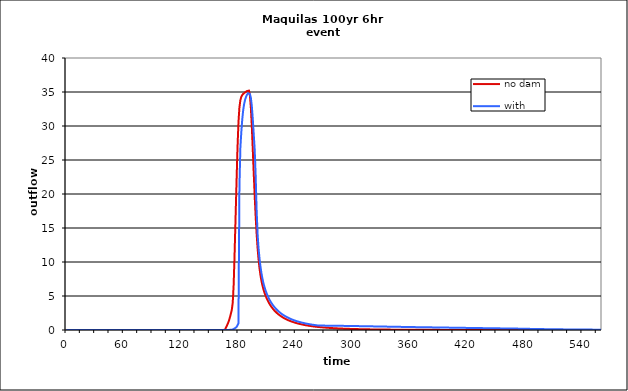
| Category | no dam | with dam |
|---|---|---|
| 0.0 | 0 | 0 |
| 1.0 | 0 | 0 |
| 2.0 | 0 | 0 |
| 3.0 | 0 | 0 |
| 4.0 | 0 | 0 |
| 5.0 | 0 | 0 |
| 6.0 | 0 | 0 |
| 7.0 | 0 | 0 |
| 8.0 | 0 | 0 |
| 9.0 | 0 | 0 |
| 10.0 | 0 | 0 |
| 11.0 | 0 | 0 |
| 12.0 | 0 | 0 |
| 13.0 | 0 | 0 |
| 14.0 | 0 | 0 |
| 15.0 | 0 | 0 |
| 16.0 | 0 | 0 |
| 17.0 | 0 | 0 |
| 18.0 | 0 | 0 |
| 19.0 | 0 | 0 |
| 20.0 | 0 | 0 |
| 21.0 | 0 | 0 |
| 22.0 | 0 | 0 |
| 23.0 | 0 | 0 |
| 24.0 | 0 | 0 |
| 25.0 | 0 | 0 |
| 26.0 | 0 | 0 |
| 27.0 | 0 | 0 |
| 28.0 | 0 | 0 |
| 29.0 | 0 | 0 |
| 30.0 | 0 | 0 |
| 31.0 | 0 | 0 |
| 32.0 | 0 | 0 |
| 33.0 | 0 | 0 |
| 34.0 | 0 | 0 |
| 35.0 | 0 | 0 |
| 36.0 | 0 | 0 |
| 37.0 | 0 | 0 |
| 38.0 | 0 | 0 |
| 39.0 | 0 | 0 |
| 40.0 | 0 | 0 |
| 41.0 | 0 | 0 |
| 42.0 | 0 | 0 |
| 43.0 | 0 | 0 |
| 44.0 | 0 | 0 |
| 45.0 | 0 | 0 |
| 46.0 | 0 | 0 |
| 47.0 | 0 | 0 |
| 48.0 | 0 | 0 |
| 49.0 | 0 | 0 |
| 50.0 | 0 | 0 |
| 51.0 | 0 | 0 |
| 52.0 | 0 | 0 |
| 53.0 | 0 | 0 |
| 54.0 | 0 | 0 |
| 55.0 | 0 | 0 |
| 56.0 | 0 | 0 |
| 57.0 | 0 | 0 |
| 58.0 | 0 | 0 |
| 59.0 | 0 | 0 |
| 60.0 | 0 | 0 |
| 61.0 | 0 | 0 |
| 62.0 | 0 | 0 |
| 63.0 | 0 | 0 |
| 64.0 | 0 | 0 |
| 65.0 | 0 | 0 |
| 66.0 | 0 | 0 |
| 67.0 | 0 | 0 |
| 68.0 | 0 | 0 |
| 69.0 | 0 | 0 |
| 70.0 | 0 | 0 |
| 71.0 | 0 | 0 |
| 72.0 | 0 | 0 |
| 73.0 | 0 | 0 |
| 74.0 | 0 | 0 |
| 75.0 | 0 | 0 |
| 76.0 | 0 | 0 |
| 77.0 | 0 | 0 |
| 78.0 | 0 | 0 |
| 79.0 | 0 | 0 |
| 80.0 | 0 | 0 |
| 81.0 | 0 | 0 |
| 82.0 | 0 | 0 |
| 83.0 | 0 | 0 |
| 84.0 | 0 | 0 |
| 85.0 | 0 | 0 |
| 86.0 | 0 | 0 |
| 87.0 | 0 | 0 |
| 88.0 | 0 | 0 |
| 89.0 | 0 | 0 |
| 90.0 | 0 | 0 |
| 91.0 | 0 | 0 |
| 92.0 | 0 | 0 |
| 93.0 | 0 | 0 |
| 94.0 | 0 | 0 |
| 95.0 | 0 | 0 |
| 96.0 | 0 | 0 |
| 97.0 | 0 | 0 |
| 98.0 | 0 | 0 |
| 99.0 | 0 | 0 |
| 100.0 | 0 | 0 |
| 101.0 | 0 | 0 |
| 102.0 | 0 | 0 |
| 103.0 | 0 | 0 |
| 104.0 | 0 | 0 |
| 105.0 | 0 | 0 |
| 106.0 | 0 | 0 |
| 107.0 | 0 | 0 |
| 108.0 | 0 | 0 |
| 109.0 | 0 | 0 |
| 110.0 | 0 | 0 |
| 111.0 | 0 | 0 |
| 112.0 | 0 | 0 |
| 113.0 | 0 | 0 |
| 114.0 | 0 | 0 |
| 115.0 | 0 | 0 |
| 116.0 | 0 | 0 |
| 117.0 | 0 | 0 |
| 118.0 | 0 | 0 |
| 119.0 | 0 | 0 |
| 120.0 | 0 | 0 |
| 121.0 | 0 | 0 |
| 122.0 | 0 | 0 |
| 123.0 | 0 | 0 |
| 124.0 | 0 | 0 |
| 125.0 | 0 | 0 |
| 126.0 | 0 | 0 |
| 127.0 | 0 | 0 |
| 128.0 | 0 | 0 |
| 129.0 | 0 | 0 |
| 130.0 | 0 | 0 |
| 131.0 | 0 | 0 |
| 132.0 | 0 | 0 |
| 133.0 | 0 | 0 |
| 134.0 | 0 | 0 |
| 135.0 | 0 | 0 |
| 136.0 | 0 | 0 |
| 137.0 | 0 | 0 |
| 138.0 | 0 | 0 |
| 139.0 | 0 | 0 |
| 140.0 | 0 | 0 |
| 141.0 | 0 | 0 |
| 142.0 | 0 | 0 |
| 143.0 | 0 | 0 |
| 144.0 | 0 | 0 |
| 145.0 | 0 | 0 |
| 146.0 | 0 | 0 |
| 147.0 | 0 | 0 |
| 148.0 | 0 | 0 |
| 149.0 | 0 | 0 |
| 150.0 | 0 | 0 |
| 151.0 | 0 | 0 |
| 152.0 | 0 | 0 |
| 153.0 | 0 | 0 |
| 154.0 | 0 | 0 |
| 155.0 | 0 | 0 |
| 156.0 | 0.001 | 0.001 |
| 157.0 | 0.001 | 0.001 |
| 158.0 | 0.001 | 0.001 |
| 159.0 | 0.001 | 0.001 |
| 160.0 | 0.001 | 0.001 |
| 161.0 | 0.002 | 0.002 |
| 162.0 | 0.003 | 0.002 |
| 163.0 | 0.007 | 0.003 |
| 164.0 | 0.002 | 0.004 |
| 165.0 | 0.001 | 0.005 |
| 166.0 | 0.05 | 0.006 |
| 167.0 | 0.384 | 0.007 |
| 168.0 | 0.673 | 0.009 |
| 169.0 | 0.983 | 0.01 |
| 170.0 | 1.35 | 0.011 |
| 171.0 | 1.832 | 0.016 |
| 172.0 | 2.364 | 0.03 |
| 173.0 | 2.935 | 0.05 |
| 174.0 | 3.992 | 0.066 |
| 175.0 | 6.692 | 0.118 |
| 176.0 | 11.428 | 0.232 |
| 177.0 | 16.662 | 0.349 |
| 178.0 | 21.858 | 0.433 |
| 179.0 | 26.785 | 0.493 |
| 180.0 | 30.523 | 0.99 |
| 181.0 | 32.711 | 21.022 |
| 182.0 | 33.791 | 26.779 |
| 183.0 | 34.299 | 29.13 |
| 184.0 | 34.561 | 31.006 |
| 185.0 | 34.726 | 32.38 |
| 186.0 | 34.85 | 33.285 |
| 187.0 | 34.953 | 33.888 |
| 188.0 | 35.051 | 34.308 |
| 189.0 | 35.141 | 34.603 |
| 190.0 | 35.218 | 34.812 |
| 191.0 | 35.207 | 34.884 |
| 192.0 | 34.482 | 34.712 |
| 193.0 | 32.654 | 34.137 |
| 194.0 | 29.866 | 32.911 |
| 195.0 | 26.52 | 31.008 |
| 196.0 | 23.018 | 28.774 |
| 197.0 | 19.689 | 26.521 |
| 198.0 | 16.719 | 22.73 |
| 199.0 | 14.188 | 17.722 |
| 200.0 | 12.11 | 14.191 |
| 201.0 | 10.433 | 12.091 |
| 202.0 | 9.118 | 10.558 |
| 203.0 | 8.091 | 9.363 |
| 204.0 | 7.268 | 8.41 |
| 205.0 | 6.601 | 7.628 |
| 206.0 | 6.055 | 6.981 |
| 207.0 | 5.593 | 6.44 |
| 208.0 | 5.192 | 5.975 |
| 209.0 | 4.836 | 5.57 |
| 210.0 | 4.517 | 5.21 |
| 211.0 | 4.228 | 4.888 |
| 212.0 | 3.965 | 4.595 |
| 213.0 | 3.729 | 4.329 |
| 214.0 | 3.514 | 4.088 |
| 215.0 | 3.314 | 3.869 |
| 216.0 | 3.129 | 3.667 |
| 217.0 | 2.96 | 3.481 |
| 218.0 | 2.804 | 3.31 |
| 219.0 | 2.66 | 3.15 |
| 220.0 | 2.526 | 3.002 |
| 221.0 | 2.402 | 2.864 |
| 222.0 | 2.287 | 2.734 |
| 223.0 | 2.18 | 2.613 |
| 224.0 | 2.08 | 2.5 |
| 225.0 | 1.985 | 2.395 |
| 226.0 | 1.893 | 2.295 |
| 227.0 | 1.806 | 2.201 |
| 228.0 | 1.724 | 2.112 |
| 229.0 | 1.648 | 2.028 |
| 230.0 | 1.576 | 1.949 |
| 231.0 | 1.508 | 1.873 |
| 232.0 | 1.444 | 1.801 |
| 233.0 | 1.385 | 1.733 |
| 234.0 | 1.329 | 1.667 |
| 235.0 | 1.276 | 1.605 |
| 236.0 | 1.225 | 1.545 |
| 237.0 | 1.176 | 1.489 |
| 238.0 | 1.129 | 1.437 |
| 239.0 | 1.085 | 1.388 |
| 240.0 | 1.043 | 1.341 |
| 241.0 | 1.003 | 1.297 |
| 242.0 | 0.965 | 1.254 |
| 243.0 | 0.929 | 1.213 |
| 244.0 | 0.895 | 1.174 |
| 245.0 | 0.862 | 1.137 |
| 246.0 | 0.83 | 1.101 |
| 247.0 | 0.799 | 1.067 |
| 248.0 | 0.769 | 1.034 |
| 249.0 | 0.741 | 1.002 |
| 250.0 | 0.713 | 0.972 |
| 251.0 | 0.688 | 0.943 |
| 252.0 | 0.663 | 0.914 |
| 253.0 | 0.64 | 0.887 |
| 254.0 | 0.617 | 0.862 |
| 255.0 | 0.596 | 0.837 |
| 256.0 | 0.576 | 0.813 |
| 257.0 | 0.556 | 0.79 |
| 258.0 | 0.537 | 0.767 |
| 259.0 | 0.518 | 0.746 |
| 260.0 | 0.5 | 0.726 |
| 261.0 | 0.483 | 0.706 |
| 262.0 | 0.467 | 0.687 |
| 263.0 | 0.452 | 0.67 |
| 264.0 | 0.437 | 0.659 |
| 265.0 | 0.423 | 0.652 |
| 266.0 | 0.41 | 0.65 |
| 267.0 | 0.397 | 0.648 |
| 268.0 | 0.385 | 0.647 |
| 269.0 | 0.373 | 0.645 |
| 270.0 | 0.361 | 0.644 |
| 271.0 | 0.35 | 0.642 |
| 272.0 | 0.339 | 0.641 |
| 273.0 | 0.329 | 0.639 |
| 274.0 | 0.319 | 0.638 |
| 275.0 | 0.309 | 0.636 |
| 276.0 | 0.3 | 0.634 |
| 277.0 | 0.291 | 0.633 |
| 278.0 | 0.283 | 0.631 |
| 279.0 | 0.274 | 0.629 |
| 280.0 | 0.266 | 0.627 |
| 281.0 | 0.258 | 0.625 |
| 282.0 | 0.251 | 0.623 |
| 283.0 | 0.243 | 0.621 |
| 284.0 | 0.236 | 0.619 |
| 285.0 | 0.229 | 0.617 |
| 286.0 | 0.223 | 0.615 |
| 287.0 | 0.217 | 0.613 |
| 288.0 | 0.211 | 0.611 |
| 289.0 | 0.205 | 0.609 |
| 290.0 | 0.199 | 0.607 |
| 291.0 | 0.194 | 0.605 |
| 292.0 | 0.188 | 0.603 |
| 293.0 | 0.183 | 0.6 |
| 294.0 | 0.178 | 0.598 |
| 295.0 | 0.173 | 0.596 |
| 296.0 | 0.168 | 0.594 |
| 297.0 | 0.163 | 0.591 |
| 298.0 | 0.158 | 0.589 |
| 299.0 | 0.154 | 0.587 |
| 300.0 | 0.15 | 0.584 |
| 301.0 | 0.145 | 0.582 |
| 302.0 | 0.142 | 0.58 |
| 303.0 | 0.138 | 0.577 |
| 304.0 | 0.134 | 0.575 |
| 305.0 | 0.13 | 0.573 |
| 306.0 | 0.127 | 0.57 |
| 307.0 | 0.123 | 0.568 |
| 308.0 | 0.12 | 0.565 |
| 309.0 | 0.117 | 0.563 |
| 310.0 | 0.113 | 0.56 |
| 311.0 | 0.11 | 0.558 |
| 312.0 | 0.107 | 0.556 |
| 313.0 | 0.104 | 0.553 |
| 314.0 | 0.101 | 0.551 |
| 315.0 | 0.099 | 0.548 |
| 316.0 | 0.096 | 0.546 |
| 317.0 | 0.094 | 0.543 |
| 318.0 | 0.091 | 0.541 |
| 319.0 | 0.089 | 0.538 |
| 320.0 | 0.087 | 0.536 |
| 321.0 | 0.085 | 0.533 |
| 322.0 | 0.082 | 0.531 |
| 323.0 | 0.08 | 0.528 |
| 324.0 | 0.078 | 0.526 |
| 325.0 | 0.076 | 0.523 |
| 326.0 | 0.074 | 0.52 |
| 327.0 | 0.073 | 0.518 |
| 328.0 | 0.071 | 0.515 |
| 329.0 | 0.069 | 0.513 |
| 330.0 | 0.067 | 0.51 |
| 331.0 | 0.066 | 0.508 |
| 332.0 | 0.064 | 0.505 |
| 333.0 | 0.063 | 0.503 |
| 334.0 | 0.061 | 0.5 |
| 335.0 | 0.06 | 0.498 |
| 336.0 | 0.059 | 0.495 |
| 337.0 | 0.057 | 0.493 |
| 338.0 | 0.056 | 0.49 |
| 339.0 | 0.055 | 0.488 |
| 340.0 | 0.054 | 0.485 |
| 341.0 | 0.053 | 0.482 |
| 342.0 | 0.051 | 0.48 |
| 343.0 | 0.05 | 0.477 |
| 344.0 | 0.049 | 0.475 |
| 345.0 | 0.048 | 0.472 |
| 346.0 | 0.047 | 0.47 |
| 347.0 | 0.046 | 0.467 |
| 348.0 | 0.045 | 0.465 |
| 349.0 | 0.044 | 0.462 |
| 350.0 | 0.043 | 0.46 |
| 351.0 | 0.043 | 0.457 |
| 352.0 | 0.042 | 0.455 |
| 353.0 | 0.041 | 0.452 |
| 354.0 | 0.04 | 0.45 |
| 355.0 | 0.039 | 0.447 |
| 356.0 | 0.038 | 0.445 |
| 357.0 | 0.038 | 0.442 |
| 358.0 | 0.037 | 0.44 |
| 359.0 | 0.036 | 0.437 |
| 360.0 | 0.035 | 0.435 |
| 361.0 | 0.035 | 0.432 |
| 362.0 | 0.034 | 0.43 |
| 363.0 | 0.033 | 0.427 |
| 364.0 | 0.033 | 0.425 |
| 365.0 | 0.032 | 0.423 |
| 366.0 | 0.031 | 0.421 |
| 367.0 | 0.031 | 0.419 |
| 368.0 | 0.03 | 0.417 |
| 369.0 | 0.029 | 0.415 |
| 370.0 | 0.029 | 0.412 |
| 371.0 | 0.028 | 0.41 |
| 372.0 | 0.028 | 0.408 |
| 373.0 | 0.027 | 0.406 |
| 374.0 | 0.027 | 0.404 |
| 375.0 | 0.026 | 0.402 |
| 376.0 | 0.025 | 0.4 |
| 377.0 | 0.025 | 0.398 |
| 378.0 | 0.024 | 0.396 |
| 379.0 | 0.024 | 0.394 |
| 380.0 | 0.023 | 0.392 |
| 381.0 | 0.023 | 0.389 |
| 382.0 | 0.022 | 0.387 |
| 383.0 | 0.022 | 0.385 |
| 384.0 | 0.021 | 0.383 |
| 385.0 | 0.021 | 0.381 |
| 386.0 | 0.02 | 0.379 |
| 387.0 | 0.02 | 0.377 |
| 388.0 | 0.019 | 0.375 |
| 389.0 | 0.019 | 0.373 |
| 390.0 | 0.018 | 0.371 |
| 391.0 | 0.018 | 0.369 |
| 392.0 | 0.018 | 0.367 |
| 393.0 | 0.017 | 0.364 |
| 394.0 | 0.017 | 0.362 |
| 395.0 | 0.016 | 0.36 |
| 396.0 | 0.016 | 0.358 |
| 397.0 | 0.016 | 0.356 |
| 398.0 | 0.015 | 0.354 |
| 399.0 | 0.015 | 0.352 |
| 400.0 | 0.014 | 0.35 |
| 401.0 | 0.014 | 0.348 |
| 402.0 | 0.014 | 0.346 |
| 403.0 | 0.013 | 0.344 |
| 404.0 | 0.013 | 0.341 |
| 405.0 | 0.013 | 0.339 |
| 406.0 | 0.012 | 0.337 |
| 407.0 | 0.012 | 0.335 |
| 408.0 | 0.012 | 0.333 |
| 409.0 | 0.011 | 0.331 |
| 410.0 | 0.011 | 0.329 |
| 411.0 | 0.011 | 0.327 |
| 412.0 | 0.01 | 0.325 |
| 413.0 | 0.01 | 0.323 |
| 414.0 | 0.01 | 0.321 |
| 415.0 | 0.009 | 0.318 |
| 416.0 | 0.009 | 0.316 |
| 417.0 | 0.009 | 0.314 |
| 418.0 | 0.008 | 0.312 |
| 419.0 | 0.008 | 0.31 |
| 420.0 | 0.008 | 0.308 |
| 421.0 | 0.007 | 0.306 |
| 422.0 | 0.007 | 0.304 |
| 423.0 | 0.007 | 0.302 |
| 424.0 | 0.006 | 0.3 |
| 425.0 | 0.006 | 0.298 |
| 426.0 | 0.006 | 0.296 |
| 427.0 | 0.005 | 0.293 |
| 428.0 | 0.005 | 0.291 |
| 429.0 | 0.005 | 0.289 |
| 430.0 | 0.004 | 0.287 |
| 431.0 | 0.004 | 0.285 |
| 432.0 | 0.004 | 0.283 |
| 433.0 | 0.004 | 0.281 |
| 434.0 | 0.003 | 0.279 |
| 435.0 | 0.003 | 0.277 |
| 436.0 | 0.003 | 0.275 |
| 437.0 | 0.003 | 0.273 |
| 438.0 | 0.002 | 0.271 |
| 439.0 | 0.002 | 0.269 |
| 440.0 | 0.002 | 0.267 |
| 441.0 | 0.002 | 0.265 |
| 442.0 | 0.002 | 0.263 |
| 443.0 | 0.001 | 0.261 |
| 444.0 | 0.001 | 0.259 |
| 445.0 | 0.001 | 0.257 |
| 446.0 | 0.001 | 0.255 |
| 447.0 | 0.001 | 0.253 |
| 448.0 | 0.001 | 0.251 |
| 449.0 | 0.001 | 0.249 |
| 450.0 | 0.001 | 0.247 |
| 451.0 | 0.001 | 0.245 |
| 452.0 | 0.001 | 0.243 |
| 453.0 | 0.001 | 0.241 |
| 454.0 | 0 | 0.239 |
| 455.0 | 0 | 0.237 |
| 456.0 | 0 | 0.235 |
| 457.0 | 0 | 0.233 |
| 458.0 | 0 | 0.231 |
| 459.0 | 0 | 0.229 |
| 460.0 | 0 | 0.227 |
| 461.0 | 0 | 0.225 |
| 462.0 | 0 | 0.223 |
| 463.0 | 0 | 0.221 |
| 464.0 | 0 | 0.219 |
| 465.0 | 0 | 0.217 |
| 466.0 | 0 | 0.215 |
| 467.0 | 0 | 0.213 |
| 468.0 | 0 | 0.211 |
| 469.0 | 0 | 0.209 |
| 470.0 | 0 | 0.207 |
| 471.0 | 0 | 0.206 |
| 472.0 | 0 | 0.203 |
| 473.0 | 0 | 0.201 |
| 474.0 | 0 | 0.198 |
| 475.0 | 0 | 0.195 |
| 476.0 | 0 | 0.192 |
| 477.0 | 0 | 0.189 |
| 478.0 | 0 | 0.186 |
| 479.0 | 0 | 0.183 |
| 480.0 | 0 | 0.18 |
| 481.0 | 0 | 0.177 |
| 482.0 | 0 | 0.174 |
| 483.0 | 0 | 0.171 |
| 484.0 | 0 | 0.168 |
| 485.0 | 0 | 0.165 |
| 486.0 | 0 | 0.163 |
| 487.0 | 0 | 0.16 |
| 488.0 | 0 | 0.157 |
| 489.0 | 0 | 0.155 |
| 490.0 | 0 | 0.152 |
| 491.0 | 0 | 0.15 |
| 492.0 | 0 | 0.147 |
| 493.0 | 0 | 0.145 |
| 494.0 | 0 | 0.142 |
| 495.0 | 0 | 0.14 |
| 496.0 | 0 | 0.137 |
| 497.0 | 0 | 0.135 |
| 498.0 | 0 | 0.133 |
| 499.0 | 0 | 0.131 |
| 500.0 | 0 | 0.129 |
| 501.0 | 0 | 0.126 |
| 502.0 | 0 | 0.124 |
| 503.0 | 0 | 0.122 |
| 504.0 | 0 | 0.12 |
| 505.0 | 0 | 0.118 |
| 506.0 | 0 | 0.116 |
| 507.0 | 0 | 0.114 |
| 508.0 | 0 | 0.112 |
| 509.0 | 0 | 0.111 |
| 510.0 | 0 | 0.109 |
| 511.0 | 0 | 0.107 |
| 512.0 | 0 | 0.105 |
| 513.0 | 0 | 0.103 |
| 514.0 | 0 | 0.102 |
| 515.0 | 0 | 0.1 |
| 516.0 | 0 | 0.098 |
| 517.0 | 0 | 0.097 |
| 518.0 | 0 | 0.095 |
| 519.0 | 0 | 0.093 |
| 520.0 | 0 | 0.092 |
| 521.0 | 0 | 0.09 |
| 522.0 | 0 | 0.089 |
| 523.0 | 0 | 0.087 |
| 524.0 | 0 | 0.086 |
| 525.0 | 0 | 0.084 |
| 526.0 | 0 | 0.083 |
| 527.0 | 0 | 0.082 |
| 528.0 | 0 | 0.08 |
| 529.0 | 0 | 0.079 |
| 530.0 | 0 | 0.078 |
| 531.0 | 0 | 0.076 |
| 532.0 | 0 | 0.075 |
| 533.0 | 0 | 0.074 |
| 534.0 | 0 | 0.072 |
| 535.0 | 0 | 0.071 |
| 536.0 | 0 | 0.07 |
| 537.0 | 0 | 0.069 |
| 538.0 | 0 | 0.068 |
| 539.0 | 0 | 0.067 |
| 540.0 | 0 | 0.065 |
| 541.0 | 0 | 0.064 |
| 542.0 | 0 | 0.063 |
| 543.0 | 0 | 0.062 |
| 544.0 | 0 | 0.061 |
| 545.0 | 0 | 0.06 |
| 546.0 | 0 | 0.059 |
| 547.0 | 0 | 0.058 |
| 548.0 | 0 | 0.057 |
| 549.0 | 0 | 0.056 |
| 550.0 | 0 | 0.055 |
| 551.0 | 0 | 0.054 |
| 552.0 | 0 | 0.053 |
| 553.0 | 0 | 0.052 |
| 554.0 | 0 | 0.052 |
| 555.0 | 0 | 0.051 |
| 556.0 | 0 | 0.05 |
| 557.0 | 0 | 0.049 |
| 558.0 | 0 | 0.048 |
| 559.0 | 0 | 0.047 |
| 560.0 | 0 | 0.047 |